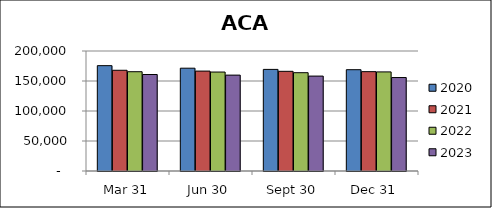
| Category | 2020 | 2021 | 2022 | 2023 |
|---|---|---|---|---|
| Mar 31 | 175586 | 167879 | 165469 | 160832 |
| Jun 30 | 171336 | 166527 | 164944 | 159798 |
| Sept 30 | 169328 | 166123 | 163854 | 158197 |
| Dec 31 | 168839 | 165575 | 165157 | 155774 |